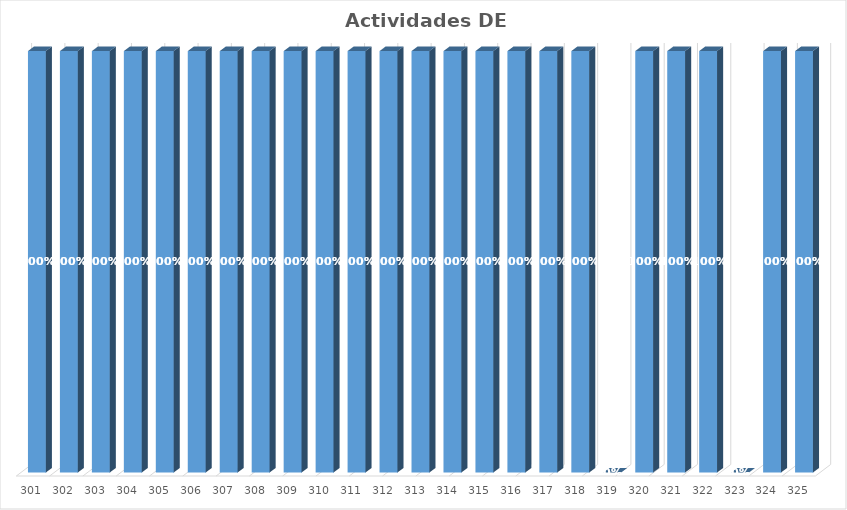
| Category | % Avance |
|---|---|
| 301.0 | 1 |
| 302.0 | 1 |
| 303.0 | 1 |
| 304.0 | 1 |
| 305.0 | 1 |
| 306.0 | 1 |
| 307.0 | 1 |
| 308.0 | 1 |
| 309.0 | 1 |
| 310.0 | 1 |
| 311.0 | 1 |
| 312.0 | 1 |
| 313.0 | 1 |
| 314.0 | 1 |
| 315.0 | 1 |
| 316.0 | 1 |
| 317.0 | 1 |
| 318.0 | 1 |
| 319.0 | 0 |
| 320.0 | 1 |
| 321.0 | 1 |
| 322.0 | 1 |
| 323.0 | 0 |
| 324.0 | 1 |
| 325.0 | 1 |